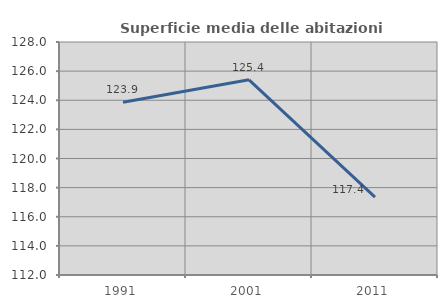
| Category | Superficie media delle abitazioni occupate |
|---|---|
| 1991.0 | 123.868 |
| 2001.0 | 125.402 |
| 2011.0 | 117.353 |